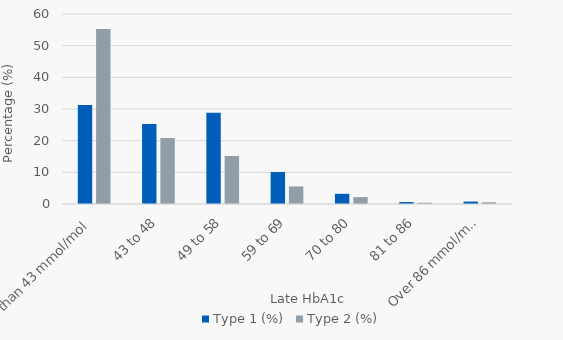
| Category | Type 1 (%) | Type 2 (%) |
|---|---|---|
| Less than 43 mmol/mol | 31.24 | 55.285 |
| 43 to 48 | 25.268 | 20.867 |
| 49 to 58 | 28.79 | 15.176 |
| 59 to 69 | 10.107 | 5.556 |
| 70 to 80 | 3.216 | 2.168 |
| 81 to 86 | 0.613 | 0.407 |
| Over 86 mmol/mol | 0.766 | 0.542 |